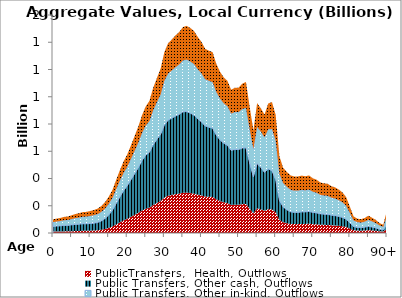
| Category | PublicTransfers,  Health, Outflows | Public Transfers, Other cash, Outflows | Public Transfers, Other in-kind, Outflows | Public Transfers, Education, Outflows |
|---|---|---|---|---|
| 0 | 10.28 | 38.343 | 31.34 | 20.34 |
|  | 10.75 | 40.053 | 33.318 | 21.623 |
| 2 | 11.165 | 41.552 | 35.165 | 22.822 |
| 3 | 11.875 | 43.897 | 37.928 | 24.616 |
| 4 | 12.153 | 44.208 | 39.19 | 25.435 |
| 5 | 13.138 | 46.59 | 42.623 | 27.663 |
| 6 | 14.167 | 48.79 | 46.124 | 29.934 |
| 7 | 14.953 | 50.066 | 48.79 | 31.665 |
| 8 | 15.897 | 51.63 | 51.857 | 33.656 |
| 9 | 16.282 | 51.387 | 53.1 | 34.462 |
| 10 | 17.105 | 52.224 | 55.697 | 36.148 |
| 11 | 18.2 | 53.831 | 58.535 | 37.99 |
| 12 | 20.101 | 57.19 | 61.419 | 39.861 |
| 13 | 23.654 | 64.694 | 66.354 | 43.064 |
| 14 | 29.137 | 76.661 | 72.594 | 47.114 |
| 15 | 37.177 | 95.065 | 80.833 | 52.461 |
| 16 | 47.602 | 118.62 | 90.116 | 58.486 |
| 17 | 62.519 | 152.772 | 104.859 | 68.054 |
| 18 | 77.834 | 186.861 | 118.219 | 76.725 |
| 19 | 92.234 | 217.484 | 130.221 | 84.514 |
| 20 | 104.335 | 242.157 | 139.329 | 90.425 |
| 21 | 118.904 | 272.152 | 152.774 | 99.151 |
| 22 | 133.595 | 301.935 | 167.678 | 108.824 |
| 23 | 148.333 | 332.083 | 183.667 | 119.201 |
| 24 | 165.067 | 367.634 | 202.006 | 131.103 |
| 25 | 177.963 | 393.08 | 217.502 | 141.16 |
| 26 | 186.161 | 407.407 | 228.657 | 148.4 |
| 27 | 205.343 | 443.122 | 253.502 | 164.524 |
| 28 | 220.106 | 467.278 | 272.687 | 176.976 |
| 29 | 235.047 | 489.146 | 292.785 | 190.02 |
| 30 | 259.686 | 532.248 | 324.539 | 210.628 |
| 31 | 273.403 | 554.404 | 342.153 | 222.059 |
| 32 | 279.319 | 563.154 | 350.128 | 227.235 |
| 33 | 285.161 | 572.891 | 358.9 | 232.928 |
| 34 | 289.001 | 581.428 | 366.59 | 237.919 |
| 35 | 295.162 | 594.091 | 377.017 | 244.687 |
| 36 | 296.521 | 595.076 | 381.384 | 247.52 |
| 37 | 292.851 | 587.074 | 379.044 | 246.002 |
| 38 | 288.652 | 576.255 | 374.678 | 243.168 |
| 39 | 281.601 | 556.66 | 364.411 | 236.505 |
| 40 | 275.976 | 540.26 | 355.888 | 230.973 |
| 41 | 267.352 | 518.35 | 343.399 | 222.868 |
| 42 | 266.339 | 510.31 | 340.644 | 221.08 |
| 43 | 264.652 | 504.502 | 338.682 | 219.807 |
| 44 | 247.265 | 471.297 | 317.57 | 206.105 |
| 45 | 234.778 | 448.6 | 303.506 | 196.977 |
| 46 | 225.712 | 433.422 | 292.935 | 190.116 |
| 47 | 219.365 | 424.491 | 286.811 | 186.142 |
| 48 | 205.684 | 400.494 | 270.021 | 175.245 |
| 49 | 207.565 | 406.044 | 274.355 | 178.058 |
| 50 | 207.274 | 405.362 | 275.267 | 178.65 |
| 51 | 211.856 | 412.018 | 286.261 | 185.785 |
| 52 | 213.715 | 410.99 | 293.335 | 190.376 |
| 53 | 178.046 | 335.661 | 249.385 | 161.853 |
| 54 | 144.584 | 266.718 | 207.229 | 134.493 |
| 55 | 181.632 | 328.334 | 268.671 | 174.369 |
| 56 | 173.378 | 307.317 | 263.484 | 171.003 |
| 57 | 163.086 | 281.864 | 257.307 | 166.994 |
| 58 | 175.477 | 295.181 | 290.965 | 188.838 |
| 59 | 173.896 | 283.215 | 305.77 | 198.446 |
| 60 | 153.093 | 238.503 | 288.501 | 187.239 |
| 61 | 96.853 | 143.482 | 196.446 | 127.495 |
| 62 | 79.446 | 112.904 | 174.288 | 113.114 |
| 63 | 72.078 | 99.057 | 168.312 | 109.236 |
| 64 | 66.647 | 89.146 | 162.022 | 105.153 |
| 65 | 65.169 | 86.432 | 159.651 | 103.614 |
| 66 | 65.093 | 86.276 | 159.891 | 103.77 |
| 67 | 66.698 | 88.196 | 161.584 | 104.869 |
| 68 | 66.786 | 88.284 | 158.637 | 102.956 |
| 69 | 68.373 | 90.424 | 159.9 | 103.776 |
| 70 | 65.199 | 86.059 | 151.955 | 98.619 |
| 71 | 63.893 | 84.053 | 147.725 | 95.875 |
| 72 | 60.886 | 79.957 | 139.676 | 90.65 |
| 73 | 59.8 | 78.476 | 137.264 | 89.085 |
| 74 | 59.342 | 77.898 | 135.987 | 88.257 |
| 75 | 56.559 | 74.287 | 129.243 | 83.88 |
| 76 | 55.11 | 72.443 | 125.693 | 81.575 |
| 77 | 52.651 | 69.169 | 119.564 | 77.598 |
| 78 | 49.451 | 64.913 | 111.272 | 72.216 |
| 79 | 43.737 | 57.401 | 98.231 | 63.753 |
| 80 | 32.138 | 42.21 | 71.896 | 46.661 |
| 81 | 20.274 | 26.672 | 45.184 | 29.325 |
| 82 | 17.626 | 23.255 | 39.213 | 25.45 |
| 83 | 16.855 | 22.314 | 37.519 | 24.35 |
| 84 | 18.417 | 24.419 | 40.891 | 26.539 |
| 85 | 21.229 | 28.113 | 47.061 | 30.543 |
| 86 | 18.796 | 24.765 | 41.434 | 26.891 |
| 87 | 16.106 | 21.031 | 35.311 | 22.917 |
| 88 | 12.413 | 15.984 | 27.152 | 17.622 |
| 89 | 10.27 | 13.008 | 22.374 | 14.521 |
| 90+ | 28.456 | 35.41 | 61.731 | 40.064 |